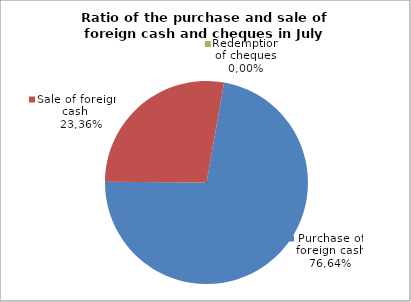
| Category | Purchase of foreign cash |
|---|---|
| 0 | 72.34 |
| 1 | 27.66 |
| 2 | 0 |